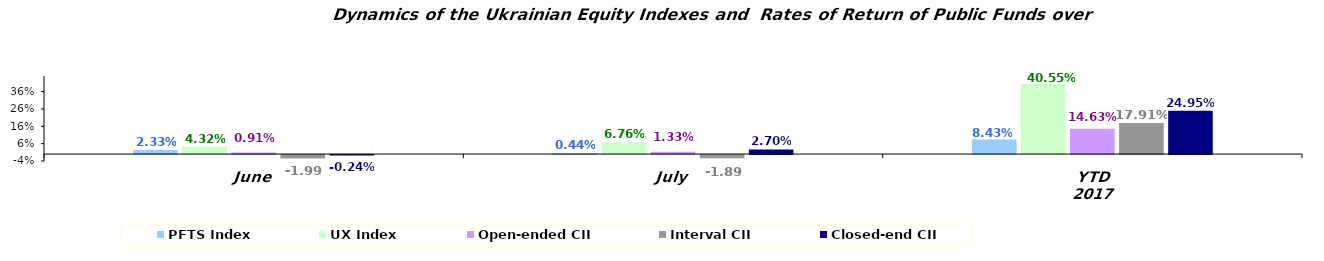
| Category | PFTS Index | UX Index | Open-ended CII | Interval CII | Closed-end CII |
|---|---|---|---|---|---|
| June | 0.023 | 0.043 | 0.009 | -0.02 | -0.002 |
| July | 0.004 | 0.068 | 0.013 | -0.019 | 0.027 |
| YTD 2017 | 0.084 | 0.406 | 0.146 | 0.179 | 0.249 |